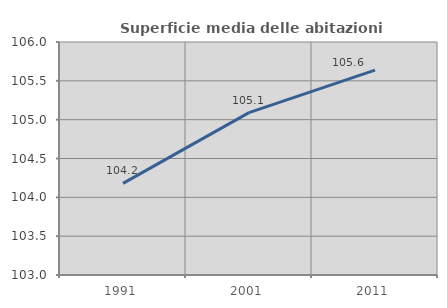
| Category | Superficie media delle abitazioni occupate |
|---|---|
| 1991.0 | 104.179 |
| 2001.0 | 105.091 |
| 2011.0 | 105.639 |